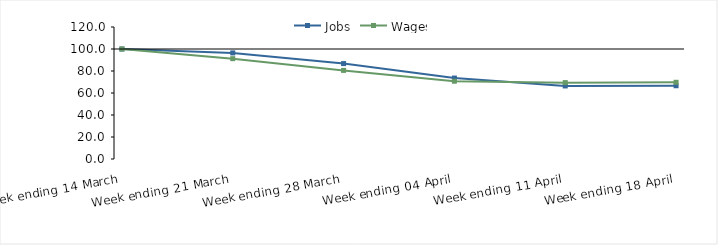
| Category | Jobs | Wages |
|---|---|---|
| 0 | 100 | 100 |
| 1900-01-01 | 96.441 | 91.208 |
| 1900-01-02 | 86.749 | 80.557 |
| 1900-01-03 | 73.581 | 70.711 |
| 1900-01-04 | 66.418 | 69.428 |
| 1900-01-05 | 66.6 | 69.736 |